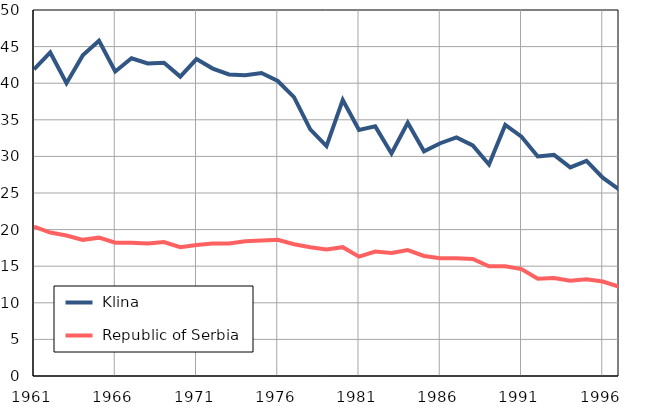
| Category |  Klina |  Republic of Serbia |
|---|---|---|
| 1961.0 | 41.9 | 20.4 |
| 1962.0 | 44.2 | 19.6 |
| 1963.0 | 40 | 19.2 |
| 1964.0 | 43.8 | 18.6 |
| 1965.0 | 45.8 | 18.9 |
| 1966.0 | 41.6 | 18.2 |
| 1967.0 | 43.4 | 18.2 |
| 1968.0 | 42.7 | 18.1 |
| 1969.0 | 42.8 | 18.3 |
| 1970.0 | 40.9 | 17.6 |
| 1971.0 | 43.3 | 17.9 |
| 1972.0 | 42 | 18.1 |
| 1973.0 | 41.2 | 18.1 |
| 1974.0 | 41.1 | 18.4 |
| 1975.0 | 41.4 | 18.5 |
| 1976.0 | 40.3 | 18.6 |
| 1977.0 | 38.1 | 18 |
| 1978.0 | 33.7 | 17.6 |
| 1979.0 | 31.4 | 17.3 |
| 1980.0 | 37.7 | 17.6 |
| 1981.0 | 33.6 | 16.3 |
| 1982.0 | 34.1 | 17 |
| 1983.0 | 30.4 | 16.8 |
| 1984.0 | 34.6 | 17.2 |
| 1985.0 | 30.7 | 16.4 |
| 1986.0 | 31.8 | 16.1 |
| 1987.0 | 32.6 | 16.1 |
| 1988.0 | 31.5 | 16 |
| 1989.0 | 28.9 | 15 |
| 1990.0 | 34.3 | 15 |
| 1991.0 | 32.7 | 14.6 |
| 1992.0 | 30 | 13.3 |
| 1993.0 | 30.2 | 13.4 |
| 1994.0 | 28.5 | 13 |
| 1995.0 | 29.4 | 13.2 |
| 1996.0 | 27.1 | 12.9 |
| 1997.0 | 25.5 | 12.2 |